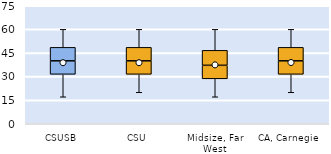
| Category | 25th | 50th | 75th |
|---|---|---|---|
| CSUSB | 31.429 | 8.571 | 8.571 |
| CSU | 31.429 | 8.571 | 8.571 |
| Midsize, Far West | 28.571 | 8.571 | 9.524 |
| CA, Carnegie | 31.429 | 8.571 | 8.571 |